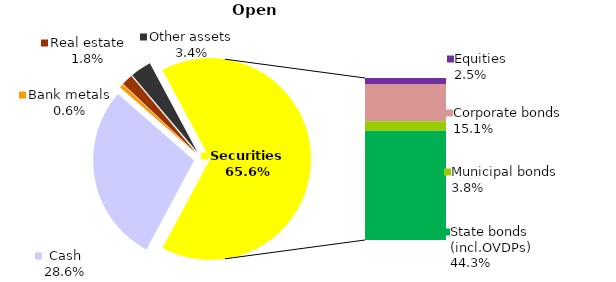
| Category | Open |
|---|---|
| Cash | 468.454 |
| Bank metals | 10.307 |
| Real estate | 29.031 |
| Other assets | 54.986 |
| Equities | 40.377 |
| Corporate bonds | 246.931 |
| Municipal bonds | 62.507 |
| State bonds (incl.OVDPs) | 725.476 |